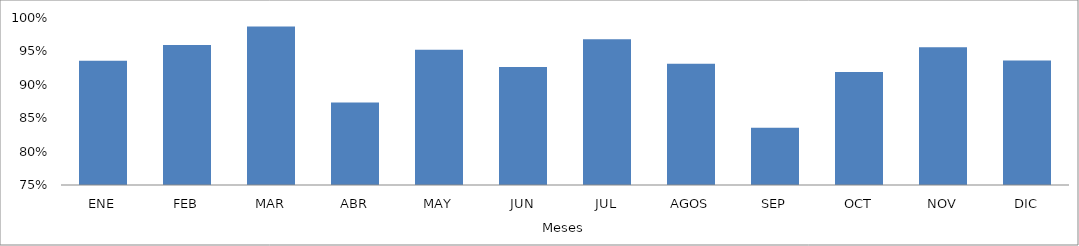
| Category | Series 0 |
|---|---|
| ENE | 0.936 |
| FEB | 0.96 |
| MAR | 0.987 |
| ABR | 0.874 |
| MAY | 0.953 |
| JUN | 0.927 |
| JUL | 0.968 |
| AGOS | 0.931 |
| SEP | 0.836 |
| OCT | 0.919 |
| NOV | 0.956 |
| DIC | 0.936 |